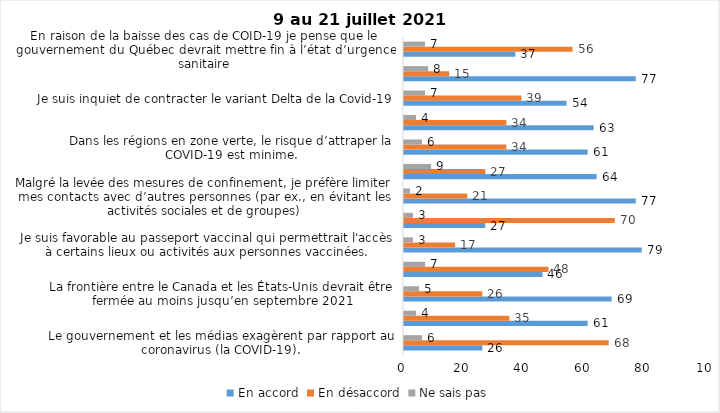
| Category | En accord | En désaccord | Ne sais pas |
|---|---|---|---|
| Le gouvernement et les médias exagèrent par rapport au coronavirus (la COVID-19). | 26 | 68 | 6 |
| J’ai peur que le système de santé soit débordé par les cas de COVID-19 suite au "déconfinement" | 61 | 35 | 4 |
| La frontière entre le Canada et les États-Unis devrait être fermée au moins jusqu’en septembre 2021 | 69 | 26 | 5 |
| Les personnes vaccinées contre la COVID-19 devraient avoir le droit de faire des rassemblements privés et de ne plus porter le masque dans les lieux publics. | 46 | 48 | 7 |
| Je suis favorable au passeport vaccinal qui permettrait l'accès à certains lieux ou activités aux personnes vaccinées. | 79 | 17 | 3 |
| Étant donné la progression de la vaccination et la diminution du nombre de cas de COVID-19, je pense qu’il est moins important de suivre les mesures de prévention. | 27 | 70 | 3 |
| Malgré la levée des mesures de confinement, je préfère limiter mes contacts avec d’autres personnes (par ex., en évitant les activités sociales et de groupes) | 77 | 21 | 2 |
| J’ai peur qu’il y ait une 4e vague de la COVID-19. | 64 | 27 | 9 |
| Dans les régions en zone verte, le risque d’attraper la COVID-19 est minime. | 61 | 34 | 6 |
| Si les cas de COVID-19 augmentent cet automne, je suis favorable à la mise en place de mesures de confinement (ex. fermeture de services non essentiels, interdiction des rassemblements privés) | 63 | 34 | 4 |
| Je suis inquiet de contracter le variant Delta de la Covid-19 | 54 | 39 | 7 |
| Je suis confiant que la vaccination protège efficacement contre les variants de la COVID-19 | 77 | 15 | 8 |
| En raison de la baisse des cas de COID-19 je pense que le gouvernement du Québec devrait mettre fin à l’état d’urgence sanitaire | 37 | 56 | 7 |